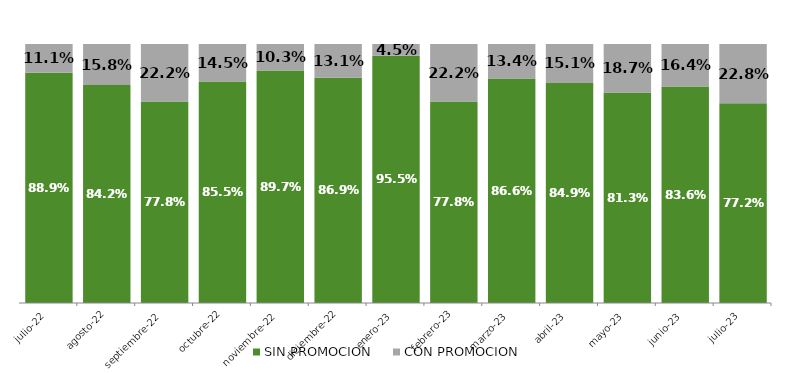
| Category | SIN PROMOCION   | CON PROMOCION   |
|---|---|---|
| 2022-07-01 | 0.889 | 0.111 |
| 2022-08-01 | 0.842 | 0.158 |
| 2022-09-01 | 0.778 | 0.222 |
| 2022-10-01 | 0.855 | 0.145 |
| 2022-11-01 | 0.897 | 0.103 |
| 2022-12-01 | 0.869 | 0.131 |
| 2023-01-01 | 0.955 | 0.045 |
| 2023-02-01 | 0.778 | 0.222 |
| 2023-03-01 | 0.866 | 0.134 |
| 2023-04-01 | 0.849 | 0.151 |
| 2023-05-01 | 0.813 | 0.187 |
| 2023-06-01 | 0.836 | 0.164 |
| 2023-07-01 | 0.772 | 0.228 |